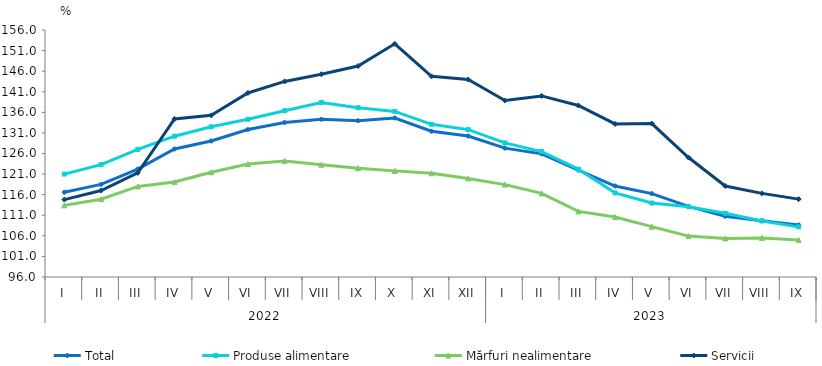
| Category | Total  | Produse alimentare | Mărfuri nealimentare  | Servicii |
|---|---|---|---|---|
| 0 | 116.6 | 121 | 113.4 | 114.8 |
| 1 | 118.5 | 123.3 | 114.9 | 117 |
| 2 | 122.2 | 127 | 118 | 121.3 |
| 3 | 127.1 | 130.2 | 119.1 | 134.4 |
| 4 | 129.047 | 132.5 | 121.45 | 135.267 |
| 5 | 131.827 | 134.301 | 123.443 | 140.701 |
| 6 | 133.547 | 136.399 | 124.168 | 143.511 |
| 7 | 134.294 | 138.387 | 123.256 | 145.253 |
| 8 | 133.971 | 137.121 | 122.424 | 147.248 |
| 9 | 134.625 | 136.226 | 121.779 | 152.646 |
| 10 | 131.406 | 133.093 | 121.201 | 144.742 |
| 11 | 130.241 | 131.801 | 119.936 | 143.965 |
| 12 | 127.307 | 128.59 | 118.441 | 138.865 |
| 13 | 125.91 | 126.47 | 116.31 | 139.99 |
| 14 | 121.977 | 122.19 | 111.932 | 137.666 |
| 15 | 118.102 | 116.414 | 110.554 | 133.178 |
| 16 | 116.262 | 113.97 | 108.228 | 133.268 |
| 17 | 113.152 | 113.076 | 105.931 | 125.017 |
| 18 | 110.755 | 111.48 | 105.365 | 118.101 |
| 19 | 109.689 | 109.605 | 105.486 | 116.313 |
| 20 | 108.634 | 108.179 | 105.004 | 114.916 |